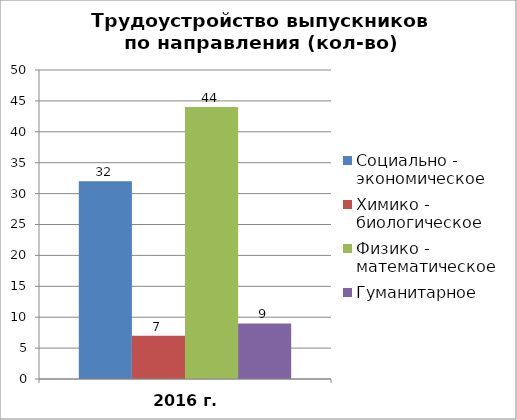
| Category | Социально - экономическое | Химико - биологическое | Физико - математическое | Гуманитарное |
|---|---|---|---|---|
| 2016 г. | 32 | 7 | 44 | 9 |